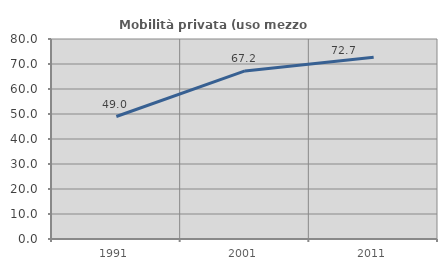
| Category | Mobilità privata (uso mezzo privato) |
|---|---|
| 1991.0 | 48.993 |
| 2001.0 | 67.222 |
| 2011.0 | 72.737 |